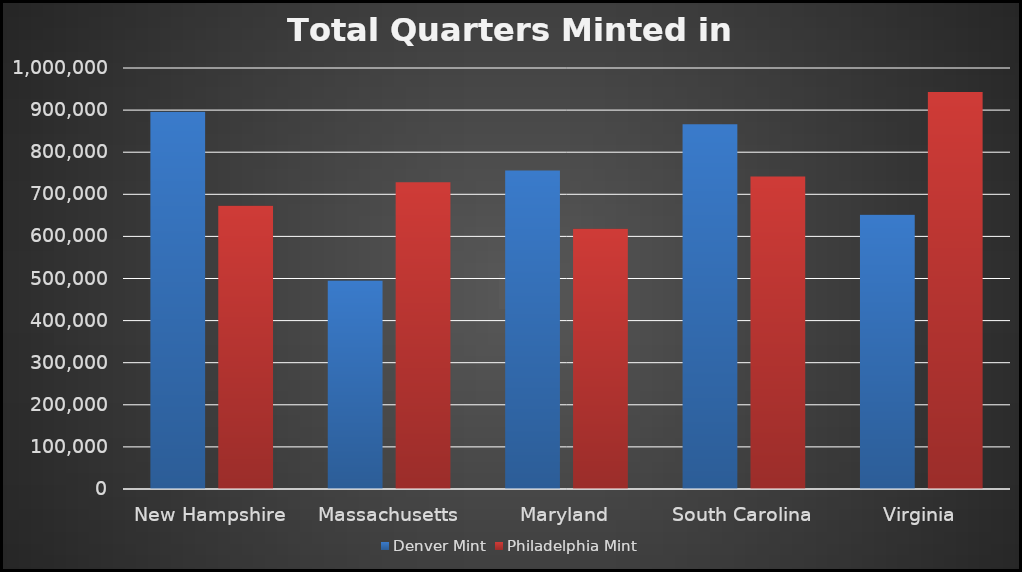
| Category | Denver Mint | Philadelphia Mint |
|---|---|---|
| New Hampshire | 895976 | 673040 |
| Massachusetts | 495184 | 728600 |
| Maryland | 756532 | 618200 |
| South Carolina | 866208 | 742576 |
| Virginia | 651616 | 943000 |